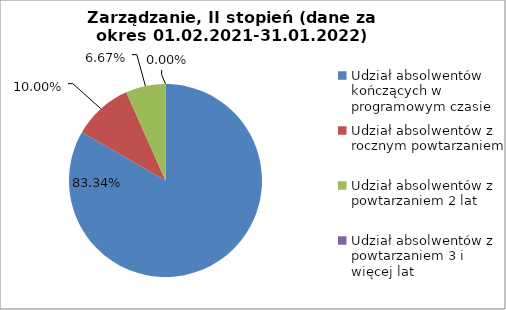
| Category | Series 0 |
|---|---|
| Udział absolwentów kończących w programowym czasie | 83.333 |
| Udział absolwentów z rocznym powtarzaniem | 10 |
| Udział absolwentów z powtarzaniem 2 lat | 6.667 |
| Udział absolwentów z powtarzaniem 3 i więcej lat | 0 |